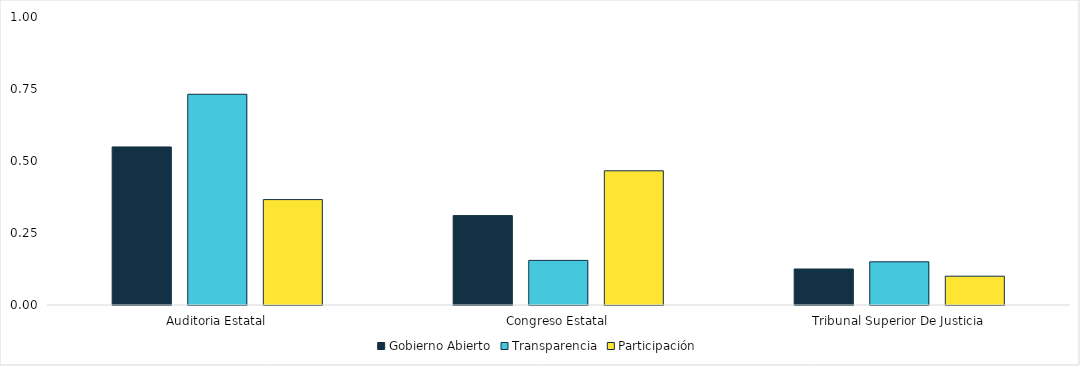
| Category | Gobierno Abierto | Transparencia | Participación |
|---|---|---|---|
| Auditoria Estatal | 0.549 | 0.732 | 0.366 |
| Congreso Estatal | 0.31 | 0.155 | 0.466 |
| Tribunal Superior De Justicia | 0.125 | 0.15 | 0.1 |